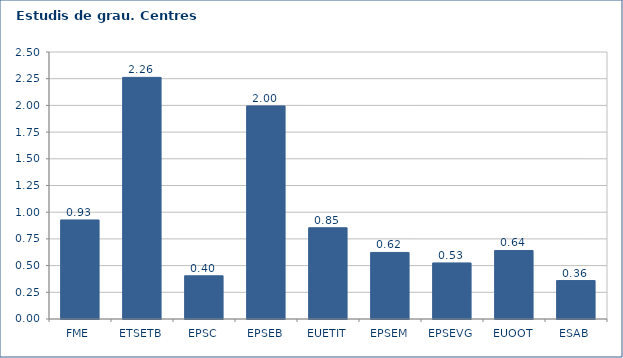
| Category | 2007-08 |
|---|---|
| FME | 0.927 |
| ETSETB | 2.262 |
| EPSC | 0.405 |
| EPSEB | 1.995 |
| EUETIT | 0.855 |
| EPSEM | 0.623 |
| EPSEVG | 0.525 |
| EUOOT | 0.642 |
| ESAB | 0.36 |